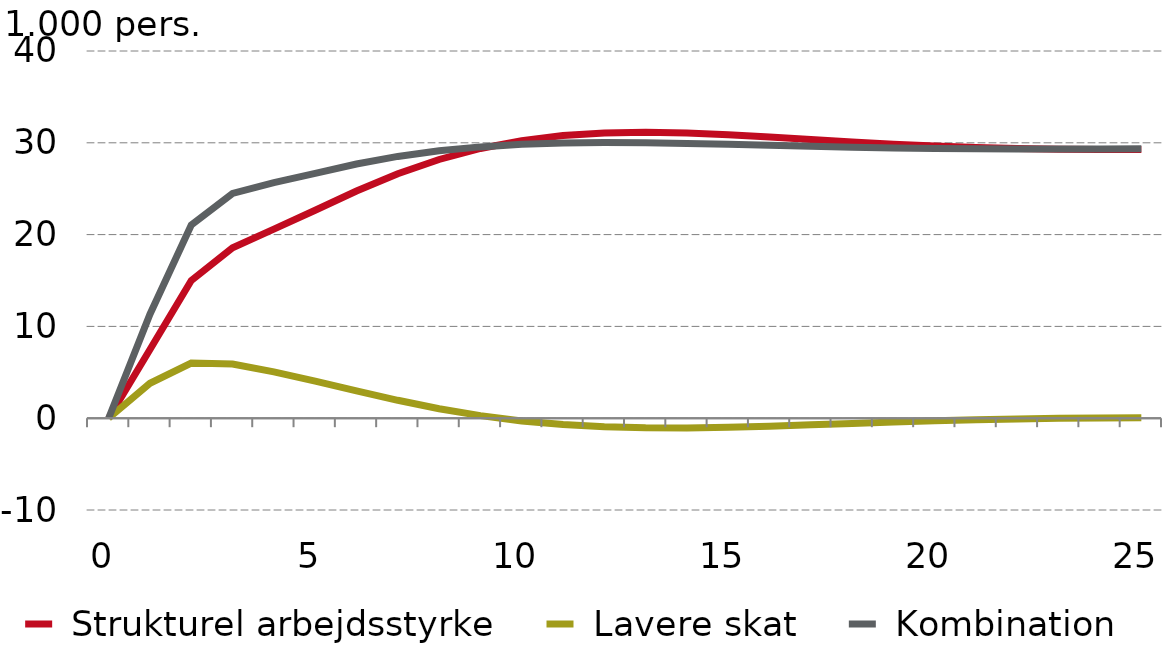
| Category |  Strukturel arbejdsstyrke |  Lavere skat |  Kombination |
|---|---|---|---|
| 0.0 | 0 | 0 | 0 |
| nan | 7.485 | 3.802 | 11.331 |
| nan | 14.993 | 6.005 | 21.046 |
| nan | 18.563 | 5.897 | 24.485 |
| nan | 20.598 | 5.053 | 25.653 |
| 5.0 | 22.648 | 4.043 | 26.671 |
| nan | 24.748 | 2.98 | 27.686 |
| nan | 26.632 | 1.95 | 28.516 |
| nan | 28.183 | 1.033 | 29.128 |
| nan | 29.381 | 0.278 | 29.555 |
| 10.0 | 30.241 | -0.296 | 29.83 |
| nan | 30.791 | -0.696 | 29.979 |
| nan | 31.078 | -0.939 | 30.03 |
| nan | 31.153 | -1.049 | 30.008 |
| nan | 31.07 | -1.056 | 29.937 |
| 15.0 | 30.88 | -0.987 | 29.837 |
| nan | 30.63 | -0.869 | 29.727 |
| nan | 30.356 | -0.724 | 29.618 |
| nan | 30.087 | -0.57 | 29.521 |
| nan | 29.844 | -0.421 | 29.441 |
| 20.0 | 29.641 | -0.287 | 29.381 |
| nan | 29.482 | -0.174 | 29.342 |
| nan | 29.37 | -0.084 | 29.323 |
| nan | 29.301 | -0.017 | 29.321 |
| nan | 29.27 | 0.029 | 29.333 |
| 25.0 | 29.271 | 0.056 | 29.356 |